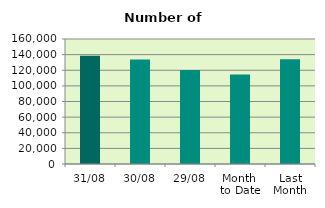
| Category | Series 0 |
|---|---|
| 31/08 | 138572 |
| 30/08 | 133748 |
| 29/08 | 120398 |
| Month 
to Date | 114688 |
| Last
Month | 134197.333 |